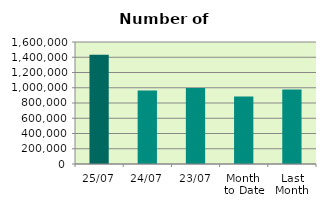
| Category | Series 0 |
|---|---|
| 25/07 | 1433534 |
| 24/07 | 964096 |
| 23/07 | 995150 |
| Month 
to Date | 884979.263 |
| Last
Month | 977938.2 |